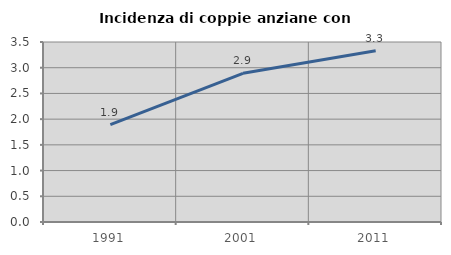
| Category | Incidenza di coppie anziane con figli |
|---|---|
| 1991.0 | 1.893 |
| 2001.0 | 2.891 |
| 2011.0 | 3.331 |